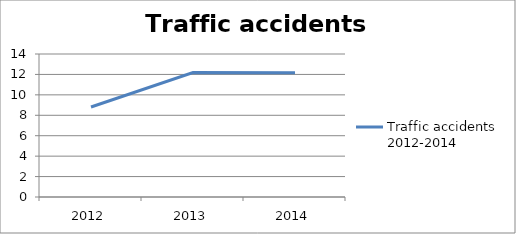
| Category | Traffic accidents 2012-2014 |
|---|---|
| 2012.0 | 8.812 |
| 2013.0 | 12.178 |
| 2014.0 | 12.165 |